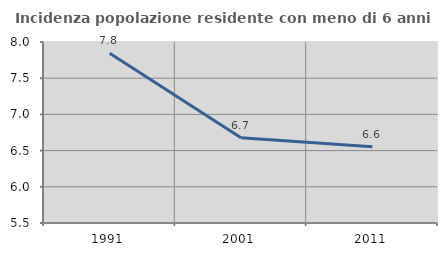
| Category | Incidenza popolazione residente con meno di 6 anni |
|---|---|
| 1991.0 | 7.844 |
| 2001.0 | 6.679 |
| 2011.0 | 6.554 |